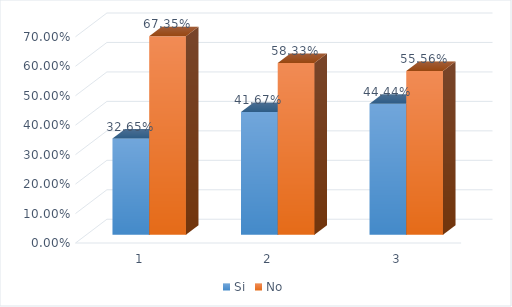
| Category | Si | No |
|---|---|---|
| 0 | 0.327 | 0.673 |
| 1 | 0.417 | 0.583 |
| 2 | 0.444 | 0.556 |